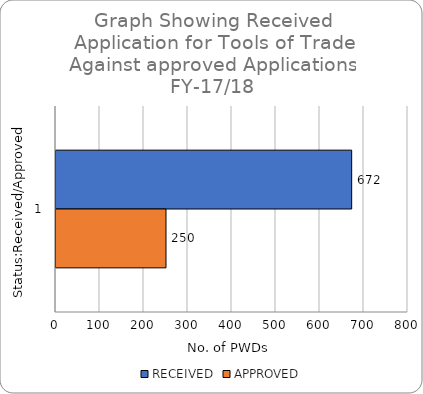
| Category | RECEIVED | APPROVED |
|---|---|---|
| 0 | 672 | 250 |